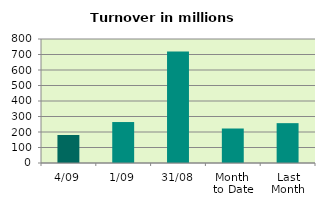
| Category | Series 0 |
|---|---|
| 4/09 | 180.782 |
| 1/09 | 264.299 |
| 31/08 | 719.063 |
| Month 
to Date | 222.54 |
| Last
Month | 257.061 |